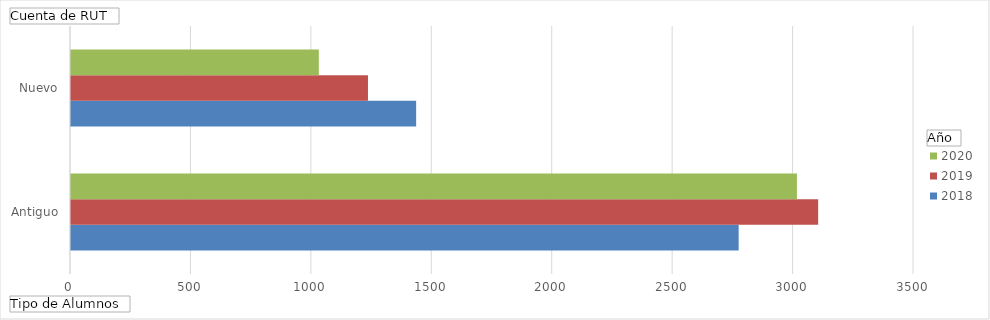
| Category | 2018 | 2019 | 2020 |
|---|---|---|---|
| Antiguo | 2772 | 3102 | 3014 |
| Nuevo | 1433 | 1233 | 1029 |